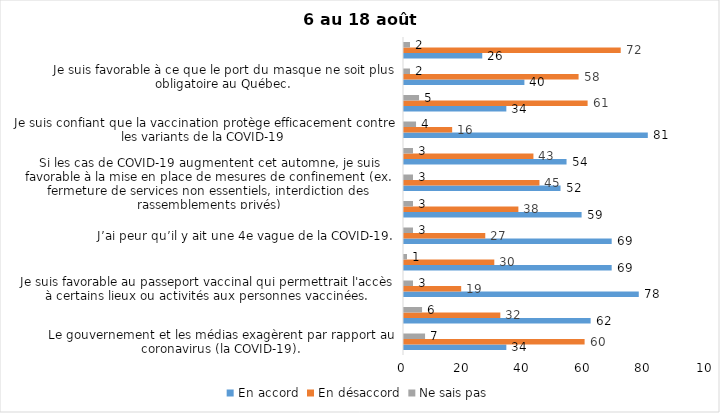
| Category | En accord | En désaccord | Ne sais pas |
|---|---|---|---|
| Le gouvernement et les médias exagèrent par rapport au coronavirus (la COVID-19). | 34 | 60 | 7 |
| J’ai peur que le système de santé soit débordé par les cas de COVID-19 suite au "déconfinement" | 62 | 32 | 6 |
| Je suis favorable au passeport vaccinal qui permettrait l'accès à certains lieux ou activités aux personnes vaccinées. | 78 | 19 | 3 |
| Malgré la levée des mesures de confinement, je préfère limiter mes contacts avec d’autres personnes (par ex., en évitant les activités sociales et de groupes) | 69 | 30 | 1 |
| J’ai peur qu’il y ait une 4e vague de la COVID-19. | 69 | 27 | 3 |
| Dans les régions en zone verte, le risque d’attraper la COVID-19 est minime. | 59 | 38 | 3 |
| Si les cas de COVID-19 augmentent cet automne, je suis favorable à la mise en place de mesures de confinement (ex. fermeture de services non essentiels, interdiction des rassemblements privés) | 52 | 45 | 3 |
| Je suis inquiet de contracter le variant Delta de la Covid-19 | 54 | 43 | 3 |
| Je suis confiant que la vaccination protège efficacement contre les variants de la COVID-19 | 81 | 16 | 4 |
| En raison de la baisse des cas de COID-19 je pense que le gouvernement du Québec devrait mettre fin à l’état d’urgence sanitaire | 34 | 61 | 5 |
| Je suis favorable à ce que le port du masque ne soit plus obligatoire au Québec. | 40 | 58 | 2 |
| Étant donné la progression de la vaccination, je pense qu’il est moins important de suivre les mesures de prévention. | 26 | 72 | 2 |